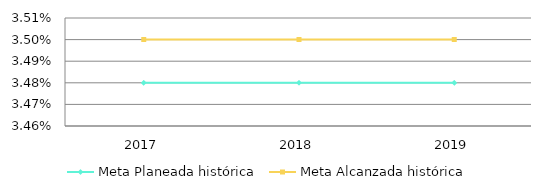
| Category | Meta Planeada histórica | Meta Alcanzada histórica |
|---|---|---|
| 0 | 0.035 | 0.035 |
| 1 | 0.035 | 0.035 |
| 2 | 0.035 | 0.035 |